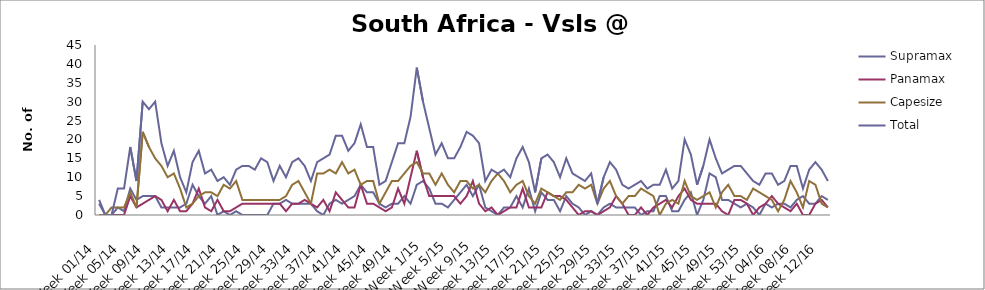
| Category | Supramax | Panamax | Capesize | Total |
|---|---|---|---|---|
| Week 01/14 | 3 | 0 | 0 | 4 |
| Week 02/14 | 0 | 0 | 0 | 0 |
| Week 03/14 | 0 | 0 | 2 | 0 |
| Week 04/14 | 2 | 0 | 2 | 7 |
| Week 05/14 | 1 | 0 | 2 | 7 |
| Week 06/14 | 7 | 5 | 6 | 18 |
| Week 07/14 | 4 | 2 | 2 | 9 |
| Week 08/14 | 5 | 3 | 22 | 30 |
| Week 09/14 | 5 | 4 | 18 | 28 |
| Week 10/14 | 5 | 5 | 15 | 30 |
| Week 11/14 | 2 | 4 | 13 | 19 |
| Week 12/14 | 2 | 1 | 10 | 13 |
| Week 13/14 | 2 | 4 | 11 | 17 |
| Week 14/14 | 2 | 1 | 7 | 10 |
| Week 15/14 | 3 | 1 | 2 | 6 |
| Week 16/14 | 8 | 3 | 3 | 14 |
| Week 17/14 | 5 | 7 | 5 | 17 |
| Week 18/14 | 3 | 2 | 6 | 11 |
| Week 19/14 | 5 | 1 | 6 | 12 |
| Week 20/14 | 0 | 4 | 5 | 9 |
| Week 21/14 | 1 | 1 | 8 | 10 |
| Week 22/14 | 0 | 1 | 7 | 8 |
| Week 23/14 | 1 | 2 | 9 | 12 |
| Week 24/14 | 0 | 3 | 4 | 13 |
| Week 25/14 | 0 | 3 | 4 | 13 |
| Week 26/14 | 0 | 3 | 4 | 12 |
| Week 27/14 | 0 | 3 | 4 | 15 |
| Week 28/14 | 0 | 3 | 4 | 14 |
| Week 29/14 | 3 | 3 | 4 | 9 |
| Week 30/14 | 3 | 3 | 4 | 13 |
| Week 31/14 | 4 | 1 | 5 | 10 |
| Week 32/14 | 3 | 3 | 8 | 14 |
| Week 33/14 | 3 | 3 | 9 | 15 |
| Week 34/14 | 3 | 4 | 6 | 13 |
| Week 35/14 | 3 | 3 | 3 | 9 |
| Week 36/14 | 1 | 2 | 11 | 14 |
| Week 37/14 | 0 | 4 | 11 | 15 |
| Week 38/14 | 3 | 1 | 12 | 16 |
| Week 39/14 | 4 | 6 | 11 | 21 |
| Week 40/14 | 3 | 4 | 14 | 21 |
| Week 41/14 | 4 | 2 | 11 | 17 |
| Week 42/14 | 5 | 2 | 12 | 19 |
| Week 43/14 | 8 | 8 | 8 | 24 |
| Week 44/14 | 6 | 3 | 9 | 18 |
| Week 45/14 | 6 | 3 | 9 | 18 |
| Week 46/14 | 3 | 2 | 3 | 8 |
| Week 47/14 | 2 | 1 | 6 | 9 |
| Week 48/14 | 3 | 2 | 9 | 14 |
| Week 49/14 | 3 | 7 | 9 | 19 |
| Week 50/14 | 5 | 3 | 11 | 19 |
| Week 51/14 | 3 | 10 | 13 | 26 |
| Week 52/14 | 8 | 17 | 14 | 39 |
| Week 1/15 | 9 | 10 | 11 | 30 |
| Week 2/15 | 7 | 5 | 11 | 23 |
| Week 3/15 | 3 | 5 | 8 | 16 |
| Week 4/15 | 3 | 5 | 11 | 19 |
| Week 5/15 | 2 | 5 | 8 | 15 |
| Week 6/15 | 4 | 5 | 6 | 15 |
| Week 7/15 | 6 | 3 | 9 | 18 |
| Week 8/15 | 8 | 5 | 9 | 22 |
| Week 9/15 | 5 | 9 | 7 | 21 |
| Week 10/15 | 8 | 3 | 8 | 19 |
| Week 11/15 | 2 | 1 | 6 | 9 |
| Week 12/15 | 1 | 2 | 9 | 12 |
| Week 13/15 | 0 | 0 | 11 | 11 |
| Week 14/15 | 2 | 1 | 9 | 12 |
| Week 15/15 | 2 | 2 | 6 | 10 |
| Week 16/15 | 5 | 2 | 8 | 15 |
| Week 17/15 | 2 | 7 | 9 | 18 |
| Week 18/15 | 7 | 2 | 5 | 14 |
| Week 19/15 | 1 | 2 | 3 | 6 |
| Week 20/15 | 6 | 2 | 7 | 15 |
| Week 21/15 | 4 | 6 | 6 | 16 |
| Week 22/15 | 4 | 5 | 5 | 14 |
| Week 23/15 | 1 | 5 | 4 | 10 |
| Week 24/15 | 5 | 4 | 6 | 15 |
| Week 25/15 | 3 | 2 | 6 | 11 |
| Week 26/15 | 2 | 0 | 8 | 10 |
| Week 27/15 | 0 | 1 | 7 | 9 |
| Week 28/15 | 1 | 1 | 8 | 11 |
| Week 29/15 | 0 | 0 | 3 | 3 |
| Week 30/15 | 2 | 1 | 7 | 10 |
| Week 31/15 | 3 | 2 | 9 | 14 |
| Week 32/15 | 2 | 5 | 5 | 12 |
| Week 33/15 | 2 | 3 | 3 | 8 |
| Week 34/15 | 2 | 0 | 5 | 7 |
| Week 35/15 | 2 | 0 | 5 | 8 |
| Week 36/15 | 0 | 2 | 7 | 9 |
| Week 37/15 | 1 | 0 | 6 | 7 |
| Week 38/15 | 1 | 2 | 5 | 8 |
| Week 39/15 | 5 | 3 | 0 | 8 |
| Week 40/15 | 5 | 4 | 3 | 12 |
| Week 41/15 | 1 | 2 | 4 | 7 |
| Week 42/15 | 1 | 5 | 3 | 9 |
| Week 43/15 | 4 | 7 | 9 | 20 |
| Week 44/15 | 6 | 4 | 5 | 16 |
| Week 45/15 | 0 | 3 | 4 | 8 |
| Week 46/15 | 4 | 3 | 5 | 13 |
| Week 47/15 | 11 | 3 | 6 | 20 |
| Week 48/15 | 10 | 3 | 2 | 15 |
| Week 49/15 | 4 | 1 | 6 | 11 |
| Week 50/15 | 4 | 0 | 8 | 12 |
| Week 51/15 | 3 | 4 | 5 | 13 |
| Week 52/15 | 2 | 4 | 5 | 13 |
| Week 53/15 | 3 | 3 | 4 | 11 |
| Week 01/16 | 2 | 0 | 7 | 9 |
| Week 02/16 | 0 | 2 | 6 | 8 |
| Week 03/16 | 3 | 3 | 5 | 11 |
| Week 04/16 | 2 | 5 | 4 | 11 |
| Week 05/16 | 3 | 3 | 1 | 8 |
| Week 06/16 | 3 | 2 | 4 | 9 |
| Week 07/16 | 2 | 1 | 9 | 13 |
| Week 08/16 | 4 | 3 | 6 | 13 |
| Week 09/16 | 5 | 0 | 2 | 7 |
| Week 10/16 | 3 | 0 | 9 | 12 |
| Week 11/16 | 3 | 3 | 8 | 14 |
| Week 12/16 | 5 | 4 | 3 | 12 |
| Week 13/16 | 4 | 2 | 2 | 9 |